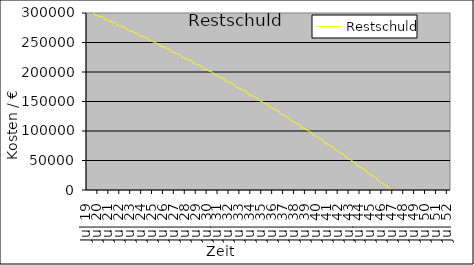
| Category | Restschuld |
|---|---|
| 2019-07-01 | 303585 |
| 2019-08-01 | 303154.921 |
| 2019-09-01 | 302724.126 |
| 2019-10-01 | 302292.612 |
| 2019-11-01 | 301860.379 |
| 2019-12-01 | 301427.426 |
| 2020-01-01 | 300993.752 |
| 2020-02-01 | 300559.354 |
| 2020-03-01 | 300124.233 |
| 2020-04-01 | 296688.386 |
| 2020-05-01 | 296246.813 |
| 2020-06-01 | 295804.504 |
| 2020-07-01 | 295361.458 |
| 2020-08-01 | 294917.673 |
| 2020-09-01 | 294473.149 |
| 2020-10-01 | 294027.883 |
| 2020-11-01 | 293581.876 |
| 2020-12-01 | 293135.125 |
| 2021-01-01 | 292687.63 |
| 2021-02-01 | 292239.389 |
| 2021-03-01 | 291790.401 |
| 2021-04-01 | 288340.665 |
| 2021-05-01 | 287885.179 |
| 2021-06-01 | 287428.934 |
| 2021-07-01 | 286971.928 |
| 2021-08-01 | 286514.161 |
| 2021-09-01 | 286055.631 |
| 2021-10-01 | 285596.336 |
| 2021-11-01 | 285136.277 |
| 2021-12-01 | 284675.45 |
| 2022-01-01 | 284213.855 |
| 2022-02-01 | 283751.491 |
| 2022-03-01 | 283288.357 |
| 2022-04-01 | 279824.45 |
| 2022-05-01 | 279354.771 |
| 2022-06-01 | 278884.308 |
| 2022-07-01 | 278413.061 |
| 2022-08-01 | 277941.029 |
| 2022-09-01 | 277468.211 |
| 2022-10-01 | 276994.604 |
| 2022-11-01 | 276520.208 |
| 2022-12-01 | 276045.021 |
| 2023-01-01 | 275569.043 |
| 2023-02-01 | 275092.271 |
| 2023-03-01 | 274614.704 |
| 2023-04-01 | 271136.341 |
| 2023-05-01 | 270652.181 |
| 2023-06-01 | 270167.215 |
| 2023-07-01 | 269681.44 |
| 2023-08-01 | 269194.855 |
| 2023-09-01 | 268707.459 |
| 2023-10-01 | 268219.251 |
| 2023-11-01 | 267730.23 |
| 2023-12-01 | 267240.393 |
| 2024-01-01 | 266749.74 |
| 2024-02-01 | 266258.269 |
| 2024-03-01 | 265765.979 |
| 2024-04-01 | 262272.869 |
| 2024-05-01 | 261773.936 |
| 2024-06-01 | 261274.172 |
| 2024-07-01 | 260773.576 |
| 2024-08-01 | 260272.144 |
| 2024-09-01 | 259769.878 |
| 2024-10-01 | 259266.774 |
| 2024-11-01 | 258762.831 |
| 2024-12-01 | 258258.049 |
| 2025-01-01 | 257752.425 |
| 2025-02-01 | 257245.959 |
| 2025-03-01 | 256738.648 |
| 2025-04-01 | 253230.492 |
| 2025-05-01 | 252716.489 |
| 2025-06-01 | 252201.63 |
| 2025-07-01 | 251685.912 |
| 2025-08-01 | 251169.335 |
| 2025-09-01 | 250651.897 |
| 2025-10-01 | 250133.596 |
| 2025-11-01 | 249614.432 |
| 2025-12-01 | 249094.402 |
| 2026-01-01 | 248573.506 |
| 2026-02-01 | 248051.741 |
| 2026-03-01 | 247529.107 |
| 2026-04-01 | 244005.602 |
| 2026-05-01 | 243476.224 |
| 2026-06-01 | 242945.964 |
| 2026-07-01 | 242414.82 |
| 2026-08-01 | 241882.791 |
| 2026-09-01 | 241349.875 |
| 2026-10-01 | 240816.071 |
| 2026-11-01 | 240281.378 |
| 2026-12-01 | 239745.793 |
| 2027-01-01 | 239209.315 |
| 2027-02-01 | 238671.944 |
| 2027-03-01 | 238133.677 |
| 2027-04-01 | 234594.512 |
| 2027-05-01 | 234049.449 |
| 2027-06-01 | 233503.478 |
| 2027-07-01 | 232956.597 |
| 2027-08-01 | 232408.804 |
| 2027-09-01 | 231860.098 |
| 2027-10-01 | 231310.478 |
| 2027-11-01 | 230759.942 |
| 2027-12-01 | 230208.488 |
| 2028-01-01 | 229656.115 |
| 2028-02-01 | 229102.821 |
| 2028-03-01 | 228548.606 |
| 2028-04-01 | 224993.466 |
| 2028-05-01 | 224432.402 |
| 2028-06-01 | 223870.402 |
| 2028-07-01 | 223307.465 |
| 2028-08-01 | 222743.591 |
| 2028-09-01 | 222178.776 |
| 2028-10-01 | 221613.021 |
| 2028-11-01 | 221046.322 |
| 2028-12-01 | 220478.679 |
| 2029-01-01 | 219910.089 |
| 2029-02-01 | 219340.552 |
| 2029-03-01 | 218770.066 |
| 2029-04-01 | 215198.629 |
| 2029-05-01 | 214621.24 |
| 2029-06-01 | 214042.888 |
| 2029-07-01 | 213463.573 |
| 2029-08-01 | 212883.292 |
| 2029-09-01 | 212302.043 |
| 2029-10-01 | 211719.826 |
| 2029-11-01 | 211136.639 |
| 2029-12-01 | 210552.48 |
| 2030-01-01 | 209967.347 |
| 2030-02-01 | 209381.238 |
| 2030-03-01 | 208794.153 |
| 2030-04-01 | 205206.09 |
| 2030-05-01 | 204612.046 |
| 2030-06-01 | 204017.013 |
| 2030-07-01 | 203420.987 |
| 2030-08-01 | 202823.968 |
| 2030-09-01 | 202225.955 |
| 2030-10-01 | 201626.944 |
| 2030-11-01 | 201026.935 |
| 2030-12-01 | 200425.926 |
| 2031-01-01 | 199823.916 |
| 2031-02-01 | 199220.902 |
| 2031-03-01 | 198616.883 |
| 2031-04-01 | 195011.858 |
| 2031-05-01 | 194400.824 |
| 2031-06-01 | 193788.771 |
| 2031-07-01 | 193175.699 |
| 2031-08-01 | 192561.604 |
| 2031-09-01 | 191946.487 |
| 2031-10-01 | 191330.344 |
| 2031-11-01 | 190713.174 |
| 2031-12-01 | 190094.975 |
| 2032-01-01 | 189475.747 |
| 2032-02-01 | 188855.486 |
| 2032-03-01 | 188234.191 |
| 2032-04-01 | 184611.861 |
| 2032-05-01 | 183983.494 |
| 2032-06-01 | 183354.079 |
| 2032-07-01 | 182723.616 |
| 2032-08-01 | 182092.101 |
| 2032-09-01 | 181459.534 |
| 2032-10-01 | 180825.913 |
| 2032-11-01 | 180191.236 |
| 2032-12-01 | 179555.501 |
| 2033-01-01 | 178918.706 |
| 2033-02-01 | 178280.85 |
| 2033-03-01 | 177641.931 |
| 2033-04-01 | 174001.948 |
| 2033-05-01 | 173355.897 |
| 2033-06-01 | 172708.77 |
| 2033-07-01 | 172060.564 |
| 2033-08-01 | 171411.278 |
| 2033-09-01 | 170760.91 |
| 2033-10-01 | 170109.457 |
| 2033-11-01 | 169456.919 |
| 2033-12-01 | 168803.294 |
| 2034-01-01 | 168148.579 |
| 2034-02-01 | 167492.773 |
| 2034-03-01 | 166835.874 |
| 2034-04-01 | 163177.88 |
| 2034-05-01 | 162513.789 |
| 2034-06-01 | 161848.592 |
| 2034-07-01 | 161182.285 |
| 2034-08-01 | 160514.869 |
| 2034-09-01 | 159846.34 |
| 2034-10-01 | 159176.697 |
| 2034-11-01 | 158505.937 |
| 2034-12-01 | 157834.06 |
| 2035-01-01 | 157161.063 |
| 2035-02-01 | 156486.945 |
| 2035-03-01 | 155811.702 |
| 2035-04-01 | 152135.335 |
| 2035-05-01 | 151452.84 |
| 2035-06-01 | 150769.208 |
| 2035-07-01 | 150084.436 |
| 2035-08-01 | 149398.523 |
| 2035-09-01 | 148711.467 |
| 2035-10-01 | 148023.265 |
| 2035-11-01 | 147333.917 |
| 2035-12-01 | 146643.42 |
| 2036-01-01 | 145951.772 |
| 2036-02-01 | 145258.971 |
| 2036-03-01 | 144565.016 |
| 2036-04-01 | 140869.903 |
| 2036-05-01 | 140168.633 |
| 2036-06-01 | 139466.194 |
| 2036-07-01 | 138762.583 |
| 2036-08-01 | 138057.801 |
| 2036-09-01 | 137351.843 |
| 2036-10-01 | 136644.709 |
| 2036-11-01 | 135936.397 |
| 2036-12-01 | 135226.904 |
| 2037-01-01 | 134516.228 |
| 2037-02-01 | 133804.368 |
| 2037-03-01 | 133091.322 |
| 2037-04-01 | 129377.087 |
| 2037-05-01 | 128656.661 |
| 2037-06-01 | 127935.035 |
| 2037-07-01 | 127212.207 |
| 2037-08-01 | 126488.173 |
| 2037-09-01 | 125762.933 |
| 2037-10-01 | 125036.484 |
| 2037-11-01 | 124308.825 |
| 2037-12-01 | 123579.952 |
| 2038-01-01 | 122849.865 |
| 2038-02-01 | 122118.561 |
| 2038-03-01 | 121386.038 |
| 2038-04-01 | 117652.295 |
| 2038-05-01 | 116912.328 |
| 2038-06-01 | 116171.128 |
| 2038-07-01 | 115428.693 |
| 2038-08-01 | 114685.02 |
| 2038-09-01 | 113940.108 |
| 2038-10-01 | 113193.955 |
| 2038-11-01 | 112446.558 |
| 2038-12-01 | 111697.915 |
| 2039-01-01 | 110948.024 |
| 2039-02-01 | 110196.884 |
| 2039-03-01 | 109444.492 |
| 2039-04-01 | 105690.845 |
| 2039-05-01 | 104930.943 |
| 2039-06-01 | 104169.774 |
| 2039-07-01 | 103407.337 |
| 2039-08-01 | 102643.629 |
| 2039-09-01 | 101878.647 |
| 2039-10-01 | 101112.391 |
| 2039-11-01 | 100344.858 |
| 2039-12-01 | 99576.046 |
| 2040-01-01 | 98805.952 |
| 2040-02-01 | 98034.575 |
| 2040-03-01 | 97261.912 |
| 2040-04-01 | 93487.962 |
| 2040-05-01 | 92707.721 |
| 2040-06-01 | 91926.18 |
| 2040-07-01 | 91143.337 |
| 2040-08-01 | 90359.189 |
| 2040-09-01 | 89573.734 |
| 2040-10-01 | 88786.97 |
| 2040-11-01 | 87998.894 |
| 2040-12-01 | 87209.505 |
| 2041-01-01 | 86418.801 |
| 2041-02-01 | 85626.778 |
| 2041-03-01 | 84833.436 |
| 2041-04-01 | 81038.771 |
| 2041-05-01 | 80237.782 |
| 2041-06-01 | 79435.458 |
| 2041-07-01 | 78631.796 |
| 2041-08-01 | 77826.796 |
| 2041-09-01 | 77020.453 |
| 2041-10-01 | 76212.767 |
| 2041-11-01 | 75403.734 |
| 2041-12-01 | 74593.354 |
| 2042-01-01 | 73781.622 |
| 2042-02-01 | 72968.538 |
| 2042-03-01 | 72154.098 |
| 2042-04-01 | 68338.301 |
| 2042-05-01 | 67516.145 |
| 2042-06-01 | 66692.618 |
| 2042-07-01 | 65867.719 |
| 2042-08-01 | 65041.444 |
| 2042-09-01 | 64213.793 |
| 2042-10-01 | 63384.762 |
| 2042-11-01 | 62554.35 |
| 2042-12-01 | 61722.553 |
| 2043-01-01 | 60889.37 |
| 2043-02-01 | 60054.799 |
| 2043-03-01 | 59218.836 |
| 2043-04-01 | 55381.481 |
| 2043-05-01 | 54537.73 |
| 2043-06-01 | 53692.572 |
| 2043-07-01 | 52846.006 |
| 2043-08-01 | 51998.029 |
| 2043-09-01 | 51148.638 |
| 2043-10-01 | 50297.832 |
| 2043-11-01 | 49445.608 |
| 2043-12-01 | 48591.964 |
| 2044-01-01 | 47736.897 |
| 2044-02-01 | 46880.405 |
| 2044-03-01 | 46022.485 |
| 2044-04-01 | 42163.135 |
| 2044-05-01 | 41297.353 |
| 2044-06-01 | 40430.129 |
| 2044-07-01 | 39561.458 |
| 2044-08-01 | 38691.34 |
| 2044-09-01 | 37819.772 |
| 2044-10-01 | 36946.751 |
| 2044-11-01 | 36072.276 |
| 2044-12-01 | 35196.342 |
| 2045-01-01 | 34318.949 |
| 2045-02-01 | 33440.094 |
| 2045-03-01 | 32559.773 |
| 2045-04-01 | 28677.986 |
| 2045-05-01 | 27789.729 |
| 2045-06-01 | 26899.991 |
| 2045-07-01 | 26008.771 |
| 2045-08-01 | 25116.065 |
| 2045-09-01 | 24221.871 |
| 2045-10-01 | 23326.187 |
| 2045-11-01 | 22429.011 |
| 2045-12-01 | 21530.339 |
| 2046-01-01 | 20630.169 |
| 2046-02-01 | 19728.499 |
| 2046-03-01 | 18825.326 |
| 2046-04-01 | 14920.647 |
| 2046-05-01 | 14009.461 |
| 2046-06-01 | 13096.757 |
| 2046-07-01 | 12182.531 |
| 2046-08-01 | 11266.781 |
| 2046-09-01 | 10349.506 |
| 2046-10-01 | 9430.701 |
| 2046-11-01 | 8510.365 |
| 2046-12-01 | 7588.495 |
| 2047-01-01 | 6665.089 |
| 2047-02-01 | 5740.144 |
| 2047-03-01 | 4813.657 |
| 2047-04-01 | 885.626 |
| 2047-05-01 | -48.952 |
| 2047-06-01 | -985.087 |
| 2047-07-01 | -1922.783 |
| 2047-08-01 | -2862.041 |
| 2047-09-01 | -3802.865 |
| 2047-10-01 | -4745.257 |
| 2047-11-01 | -5689.219 |
| 2047-12-01 | -6634.755 |
| 2048-01-01 | -7581.867 |
| 2048-02-01 | -8530.557 |
| 2048-03-01 | -9480.828 |
| 2048-04-01 | -10432.683 |
| 2048-05-01 | -11386.125 |
| 2048-06-01 | -12341.156 |
| 2048-07-01 | -13297.778 |
| 2048-08-01 | -14255.995 |
| 2048-09-01 | -15215.808 |
| 2048-10-01 | -16177.222 |
| 2048-11-01 | -17140.238 |
| 2048-12-01 | -18104.858 |
| 2049-01-01 | -19071.087 |
| 2049-02-01 | -20038.926 |
| 2049-03-01 | -21008.378 |
| 2049-04-01 | -21979.445 |
| 2049-05-01 | -22952.132 |
| 2049-06-01 | -23926.439 |
| 2049-07-01 | -24902.37 |
| 2049-08-01 | -25879.928 |
| 2049-09-01 | -26859.115 |
| 2049-10-01 | -27839.934 |
| 2049-11-01 | -28822.387 |
| 2049-12-01 | -29806.478 |
| 2050-01-01 | -30792.21 |
| 2050-02-01 | -31779.584 |
| 2050-03-01 | -32768.603 |
| 2050-04-01 | -33759.271 |
| 2050-05-01 | -34751.591 |
| 2050-06-01 | -35745.564 |
| 2050-07-01 | -36741.193 |
| 2050-08-01 | -37738.483 |
| 2050-09-01 | -38737.434 |
| 2050-10-01 | -39738.05 |
| 2050-11-01 | -40740.334 |
| 2050-12-01 | -41744.288 |
| 2051-01-01 | -42749.916 |
| 2051-02-01 | -43757.219 |
| 2051-03-01 | -44766.202 |
| 2051-04-01 | -45776.866 |
| 2051-05-01 | -46789.214 |
| 2051-06-01 | -47803.25 |
| 2051-07-01 | -48818.976 |
| 2051-08-01 | -49836.395 |
| 2051-09-01 | -50855.509 |
| 2051-10-01 | -51876.322 |
| 2051-11-01 | -52898.836 |
| 2051-12-01 | -53923.055 |
| 2052-01-01 | -54948.98 |
| 2052-02-01 | -55976.616 |
| 2052-03-01 | -57005.964 |
| 2052-04-01 | -58037.027 |
| 2052-05-01 | -59069.809 |
| 2052-06-01 | -60104.313 |
| 2052-07-01 | -61140.541 |
| 2052-08-01 | -62178.495 |
| 2052-09-01 | -63218.18 |
| 2052-10-01 | -64259.597 |